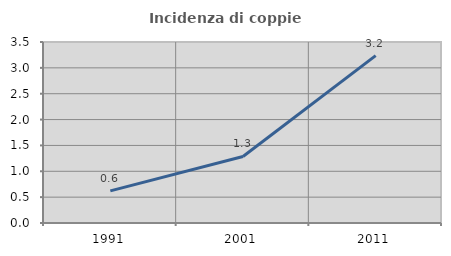
| Category | Incidenza di coppie miste |
|---|---|
| 1991.0 | 0.621 |
| 2001.0 | 1.286 |
| 2011.0 | 3.237 |